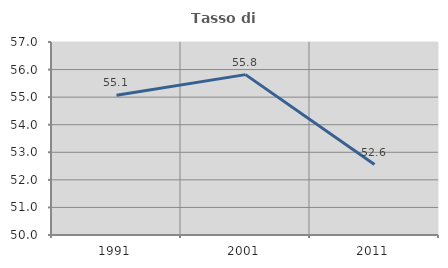
| Category | Tasso di occupazione   |
|---|---|
| 1991.0 | 55.066 |
| 2001.0 | 55.817 |
| 2011.0 | 52.557 |